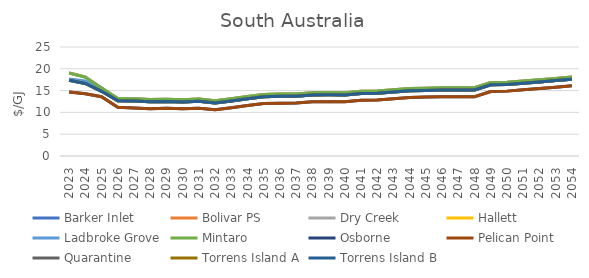
| Category | Barker Inlet | Bolivar PS | Dry Creek | Hallett | Ladbroke Grove | Mintaro | Osborne | Pelican Point | Quarantine | Torrens Island A | Torrens Island B |
|---|---|---|---|---|---|---|---|---|---|---|---|
| 2023.0 | 17.363 | 19.053 | 19.053 | 17.363 | 17.642 | 19.053 | 14.659 | 14.659 | 17.363 | 17.363 | 17.363 |
| 2024.0 | 16.63 | 18.112 | 18.112 | 16.63 | 17.234 | 18.112 | 14.257 | 14.257 | 16.63 | 16.63 | 16.63 |
| 2025.0 | 14.835 | 15.611 | 15.611 | 14.835 | 15.567 | 15.611 | 13.593 | 13.593 | 14.835 | 14.835 | 14.835 |
| 2026.0 | 12.694 | 13.194 | 13.194 | 12.694 | 12.694 | 13.194 | 11.194 | 11.194 | 12.694 | 12.694 | 12.694 |
| 2027.0 | 12.606 | 13.131 | 13.131 | 12.606 | 12.606 | 13.131 | 11.031 | 11.031 | 12.606 | 12.606 | 12.606 |
| 2028.0 | 12.424 | 12.949 | 12.949 | 12.424 | 12.424 | 12.949 | 10.849 | 10.849 | 12.424 | 12.424 | 12.424 |
| 2029.0 | 12.501 | 13.026 | 13.026 | 12.501 | 12.501 | 13.026 | 10.926 | 10.926 | 12.501 | 12.501 | 12.501 |
| 2030.0 | 12.399 | 12.924 | 12.924 | 12.399 | 12.399 | 12.924 | 10.824 | 10.824 | 12.399 | 12.399 | 12.399 |
| 2031.0 | 12.534 | 13.059 | 13.059 | 12.534 | 12.534 | 13.059 | 10.959 | 10.959 | 12.534 | 12.534 | 12.534 |
| 2032.0 | 12.173 | 12.698 | 12.698 | 12.173 | 12.173 | 12.698 | 10.598 | 10.598 | 12.173 | 12.173 | 12.173 |
| 2033.0 | 12.636 | 13.161 | 13.161 | 12.636 | 12.636 | 13.161 | 11.061 | 11.061 | 12.636 | 12.636 | 12.636 |
| 2034.0 | 13.146 | 13.671 | 13.671 | 13.146 | 13.146 | 13.671 | 11.571 | 11.571 | 13.146 | 13.146 | 13.146 |
| 2035.0 | 13.598 | 14.123 | 14.123 | 13.598 | 13.598 | 14.123 | 12.023 | 12.023 | 13.598 | 13.598 | 13.598 |
| 2036.0 | 13.685 | 14.21 | 14.21 | 13.685 | 13.685 | 14.21 | 12.11 | 12.11 | 13.685 | 13.685 | 13.685 |
| 2037.0 | 13.722 | 14.247 | 14.247 | 13.722 | 13.722 | 14.247 | 12.147 | 12.147 | 13.722 | 13.722 | 13.722 |
| 2038.0 | 14.006 | 14.531 | 14.531 | 14.006 | 14.006 | 14.531 | 12.431 | 12.431 | 14.006 | 14.006 | 14.006 |
| 2039.0 | 14.027 | 14.552 | 14.552 | 14.027 | 14.027 | 14.552 | 12.452 | 12.452 | 14.027 | 14.027 | 14.027 |
| 2040.0 | 13.973 | 14.485 | 14.485 | 13.973 | 13.973 | 14.485 | 12.435 | 12.435 | 13.973 | 13.973 | 13.973 |
| 2041.0 | 14.328 | 14.841 | 14.841 | 14.328 | 14.328 | 14.841 | 12.791 | 12.791 | 14.328 | 14.328 | 14.328 |
| 2042.0 | 14.406 | 14.919 | 14.919 | 14.406 | 14.406 | 14.919 | 12.869 | 12.869 | 14.406 | 14.406 | 14.406 |
| 2043.0 | 14.693 | 15.206 | 15.206 | 14.693 | 14.693 | 15.206 | 13.156 | 13.156 | 14.693 | 14.693 | 14.693 |
| 2044.0 | 14.943 | 15.455 | 15.455 | 14.943 | 14.943 | 15.455 | 13.405 | 13.405 | 14.943 | 14.943 | 14.943 |
| 2045.0 | 15.051 | 15.563 | 15.563 | 15.051 | 15.051 | 15.563 | 13.513 | 13.513 | 15.051 | 15.051 | 15.051 |
| 2046.0 | 15.155 | 15.668 | 15.668 | 15.155 | 15.155 | 15.668 | 13.618 | 13.618 | 15.155 | 15.155 | 15.155 |
| 2047.0 | 15.136 | 15.649 | 15.649 | 15.136 | 15.136 | 15.649 | 13.599 | 13.599 | 15.136 | 15.136 | 15.136 |
| 2048.0 | 15.14 | 15.652 | 15.652 | 15.14 | 15.14 | 15.652 | 13.602 | 13.602 | 15.14 | 15.14 | 15.14 |
| 2049.0 | 16.341 | 16.854 | 16.854 | 16.341 | 16.341 | 16.854 | 14.804 | 14.804 | 16.341 | 16.341 | 16.341 |
| 2050.0 | 16.393 | 16.897 | 16.897 | 16.393 | 16.393 | 16.897 | 14.879 | 14.879 | 16.393 | 16.393 | 16.393 |
| 2051.0 | 16.689 | 17.193 | 17.193 | 16.689 | 16.689 | 17.193 | 15.178 | 15.178 | 16.689 | 16.689 | 16.689 |
| 2052.0 | 16.99 | 17.493 | 17.493 | 16.99 | 16.99 | 17.493 | 15.482 | 15.482 | 16.99 | 16.99 | 16.99 |
| 2053.0 | 17.297 | 17.799 | 17.799 | 17.297 | 17.297 | 17.799 | 15.792 | 15.792 | 17.297 | 17.297 | 17.297 |
| 2054.0 | 17.609 | 18.11 | 18.11 | 17.609 | 17.609 | 18.11 | 16.109 | 16.109 | 17.609 | 17.609 | 17.609 |